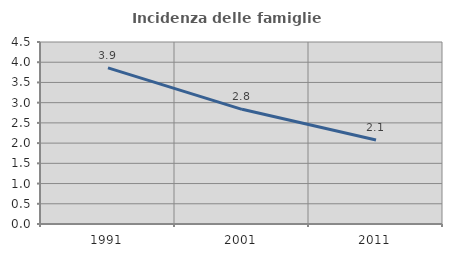
| Category | Incidenza delle famiglie numerose |
|---|---|
| 1991.0 | 3.861 |
| 2001.0 | 2.836 |
| 2011.0 | 2.075 |